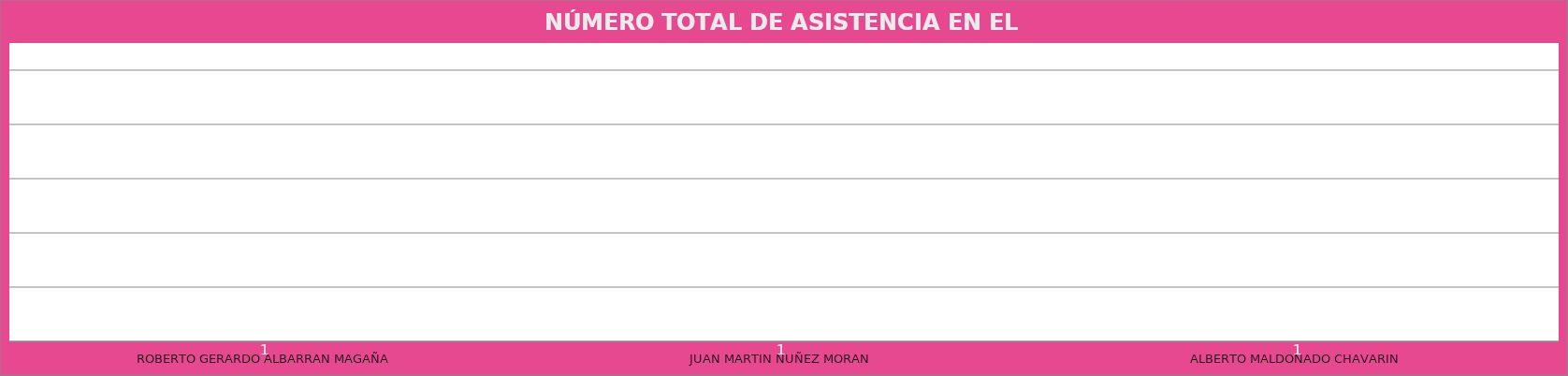
| Category | ROBERTO GERARDO ALBARRAN MAGAÑA |
|---|---|
| ROBERTO GERARDO ALBARRAN MAGAÑA | 1 |
| JUAN MARTIN NUÑEZ MORAN  | 1 |
| ALBERTO MALDONADO CHAVARIN  | 1 |